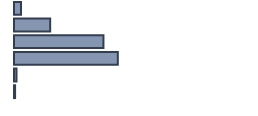
| Category | Percentatge |
|---|---|
| 0 | 2.879 |
| 1 | 15.076 |
| 2 | 37.273 |
| 3 | 43.258 |
| 4 | 1.061 |
| 5 | 0.455 |